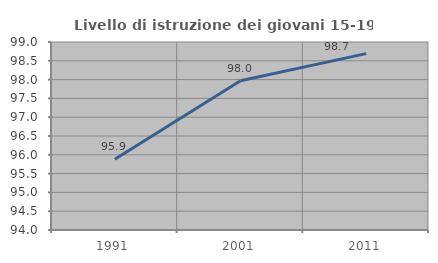
| Category | Livello di istruzione dei giovani 15-19 anni |
|---|---|
| 1991.0 | 95.884 |
| 2001.0 | 97.971 |
| 2011.0 | 98.691 |